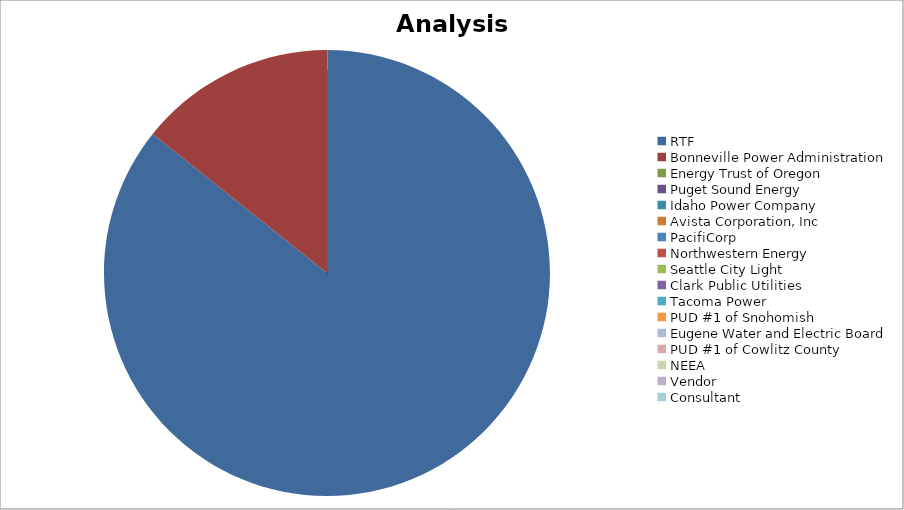
| Category | Series 0 | Series 1 | Series 2 |
|---|---|---|---|
| RTF | 6 | 1 | 0 |
| Bonneville Power Administration | 1 | 2 | 0 |
| Energy Trust of Oregon | 0 | 0 | 0 |
| Puget Sound Energy | 0 | 0 | 0 |
| Idaho Power Company | 0 | 0 | 0 |
| Avista Corporation, Inc | 0 | 0 | 0 |
| PacifiCorp | 0 | 0 | 0 |
| Northwestern Energy | 0 | 0 | 0 |
| Seattle City Light | 0 | 0 | 0 |
| Clark Public Utilities | 0 | 0 | 0 |
| Tacoma Power | 0 | 0 | 0 |
| PUD #1 of Snohomish | 0 | 0 | 0 |
| Eugene Water and Electric Board | 0 | 0 | 0 |
| PUD #1 of Cowlitz County | 0 | 0 | 0 |
| NEEA | 0 | 0 | 1 |
| Vendor | 0 | 0 | 0 |
| Consultant | 0 | 0 | 2 |